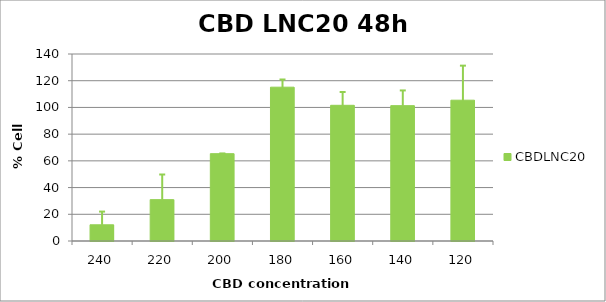
| Category | CBDLNC20 |
|---|---|
| 240.0 | 12.134 |
| 220.0 | 30.967 |
| 200.0 | 65.386 |
| 180.0 | 115.154 |
| 160.0 | 101.59 |
| 140.0 | 101.328 |
| 120.0 | 105.41 |